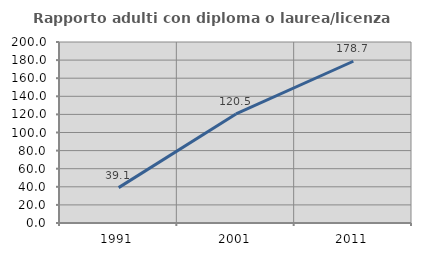
| Category | Rapporto adulti con diploma o laurea/licenza media  |
|---|---|
| 1991.0 | 39.106 |
| 2001.0 | 120.455 |
| 2011.0 | 178.736 |